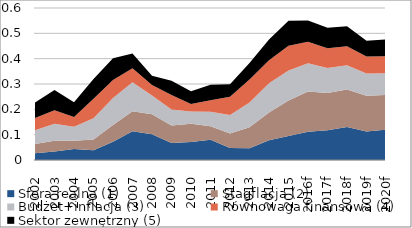
| Category | Sfera realna (1) | Stagflacja (2) | Budżet+inflacja (3) | Równowaga finansowa (4) | Sektor zewnętrzny (5) |
|---|---|---|---|---|---|
| 2002 | 0.026 | 0.037 | 0.055 | 0.048 | 0.061 |
| 2003 | 0.034 | 0.042 | 0.067 | 0.053 | 0.08 |
| 2004 | 0.044 | 0.033 | 0.056 | 0.038 | 0.058 |
| 2005 | 0.039 | 0.042 | 0.084 | 0.077 | 0.078 |
| 2006 | 0.072 | 0.066 | 0.107 | 0.07 | 0.086 |
| 2007 | 0.114 | 0.079 | 0.114 | 0.055 | 0.059 |
| 2008 | 0.102 | 0.078 | 0.074 | 0.041 | 0.037 |
| 2009 | 0.067 | 0.069 | 0.063 | 0.057 | 0.056 |
| 2010 | 0.071 | 0.071 | 0.049 | 0.03 | 0.05 |
| 2011 | 0.08 | 0.053 | 0.057 | 0.046 | 0.061 |
| 2012 | 0.048 | 0.056 | 0.074 | 0.071 | 0.05 |
| 2013 | 0.047 | 0.083 | 0.097 | 0.091 | 0.065 |
| 2014 | 0.078 | 0.11 | 0.116 | 0.091 | 0.082 |
| 2015 | 0.095 | 0.14 | 0.118 | 0.098 | 0.098 |
| 2016f | 0.111 | 0.159 | 0.111 | 0.084 | 0.084 |
| 2017f | 0.117 | 0.148 | 0.099 | 0.078 | 0.08 |
| 2018f | 0.13 | 0.148 | 0.096 | 0.075 | 0.079 |
| 2019f | 0.113 | 0.141 | 0.087 | 0.068 | 0.062 |
| 2020f | 0.119 | 0.138 | 0.085 | 0.068 | 0.066 |